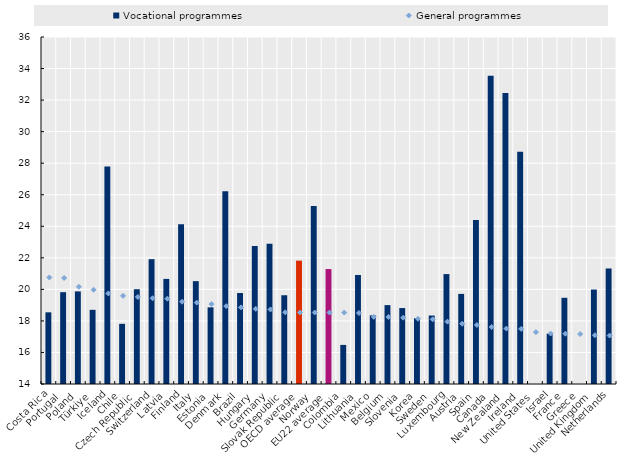
| Category | Vocational programmes |
|---|---|
| Costa Rica | 18.544 |
| Portugal | 19.822 |
| Poland | 19.871 |
| Türkiye | 18.702 |
| Iceland | 27.782 |
| Chile | 17.815 |
| Czech Republic | 20.009 |
| Switzerland | 21.914 |
| Latvia | 20.663 |
| Finland | 24.135 |
| Italy | 20.522 |
| Estonia | 18.86 |
| Denmark | 26.227 |
| Brazil | 19.77 |
| Hungary | 22.744 |
| Germany | 22.894 |
| Slovak Republic | 19.627 |
| OECD average | 21.822 |
| Norway | 25.29 |
| EU22 average | 21.288 |
| Colombia | 16.478 |
| Lithuania | 20.91 |
| Mexico | 18.355 |
| Belgium | 19.003 |
| Slovenia | 18.816 |
| Korea | 18.173 |
| Sweden | 18.342 |
| Luxembourg | 20.97 |
| Austria | 19.713 |
| Spain | 24.395 |
| Canada | 33.539 |
| New Zealand | 32.448 |
| Ireland | 28.732 |
| United States | 0 |
| Israel | 17.188 |
| France | 19.466 |
| Greece | 0 |
| United Kingdom | 19.989 |
| Netherlands | 21.325 |